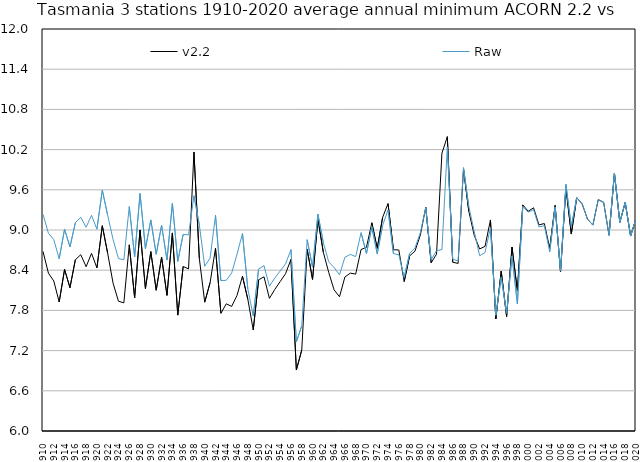
| Category | v2.2 | Raw |
|---|---|---|
| 1910 | 8.681 | 9.236 |
| 1911 | 8.357 | 8.952 |
| 1912 | 8.239 | 8.857 |
| 1913 | 7.925 | 8.57 |
| 1914 | 8.411 | 9.012 |
| 1915 | 8.14 | 8.747 |
| 1916 | 8.556 | 9.109 |
| 1917 | 8.631 | 9.19 |
| 1918 | 8.452 | 9.041 |
| 1919 | 8.651 | 9.219 |
| 1920 | 8.435 | 9.012 |
| 1921 | 9.064 | 9.595 |
| 1922 | 8.65 | 9.218 |
| 1923 | 8.206 | 8.857 |
| 1924 | 7.937 | 8.573 |
| 1925 | 7.912 | 8.556 |
| 1926 | 8.778 | 9.349 |
| 1927 | 7.988 | 8.601 |
| 1928 | 9 | 9.545 |
| 1929 | 8.126 | 8.721 |
| 1930 | 8.677 | 9.15 |
| 1931 | 8.101 | 8.638 |
| 1932 | 8.594 | 9.071 |
| 1933 | 8.025 | 8.551 |
| 1934 | 8.956 | 9.399 |
| 1935 | 7.73 | 8.532 |
| 1936 | 8.456 | 8.934 |
| 1937 | 8.419 | 8.927 |
| 1938 | 10.165 | 9.512 |
| 1939 | 8.573 | 9.076 |
| 1940 | 7.923 | 8.458 |
| 1941 | 8.216 | 8.582 |
| 1942 | 8.729 | 9.22 |
| 1943 | 7.757 | 8.244 |
| 1944 | 7.898 | 8.249 |
| 1945 | 7.859 | 8.359 |
| 1946 | 8.026 | 8.642 |
| 1947 | 8.311 | 8.948 |
| 1948 | 7.964 | 8.119 |
| 1949 | 7.507 | 7.716 |
| 1950 | 8.257 | 8.419 |
| 1951 | 8.302 | 8.468 |
| 1952 | 7.979 | 8.161 |
| 1953 | 8.113 | 8.283 |
| 1954 | 8.23 | 8.388 |
| 1955 | 8.349 | 8.495 |
| 1956 | 8.563 | 8.708 |
| 1957 | 6.91 | 7.328 |
| 1958 | 7.208 | 7.57 |
| 1959 | 8.714 | 8.855 |
| 1960 | 8.262 | 8.446 |
| 1961 | 9.163 | 9.236 |
| 1962 | 8.669 | 8.814 |
| 1963 | 8.367 | 8.524 |
| 1964 | 8.106 | 8.44 |
| 1965 | 8.004 | 8.331 |
| 1966 | 8.298 | 8.593 |
| 1967 | 8.357 | 8.636 |
| 1968 | 8.341 | 8.603 |
| 1969 | 8.709 | 8.96 |
| 1970 | 8.741 | 8.648 |
| 1971 | 9.108 | 9.048 |
| 1972 | 8.726 | 8.643 |
| 1973 | 9.189 | 9.067 |
| 1974 | 9.394 | 9.299 |
| 1975 | 8.705 | 8.648 |
| 1976 | 8.702 | 8.632 |
| 1977 | 8.23 | 8.293 |
| 1978 | 8.613 | 8.649 |
| 1979 | 8.685 | 8.731 |
| 1980 | 8.926 | 8.96 |
| 1981 | 9.34 | 9.334 |
| 1982 | 8.511 | 8.557 |
| 1983 | 8.64 | 8.692 |
| 1984 | 10.146 | 8.707 |
| 1985 | 10.393 | 10.241 |
| 1986 | 8.52 | 8.567 |
| 1987 | 8.501 | 8.537 |
| 1988 | 9.912 | 9.931 |
| 1989 | 9.275 | 9.345 |
| 1990 | 8.919 | 8.973 |
| 1991 | 8.717 | 8.615 |
| 1992 | 8.756 | 8.665 |
| 1993 | 9.15 | 9.035 |
| 1994 | 7.674 | 7.728 |
| 1995 | 8.385 | 8.294 |
| 1996 | 7.707 | 7.758 |
| 1997 | 8.746 | 8.613 |
| 1998 | 8.089 | 7.898 |
| 1999 | 9.375 | 9.352 |
| 2000 | 9.28 | 9.267 |
| 2001 | 9.331 | 9.303 |
| 2002 | 9.077 | 9.046 |
| 2003 | 9.096 | 9.064 |
| 2004 | 8.727 | 8.674 |
| 2005 | 9.366 | 9.345 |
| 2006 | 8.374 | 8.387 |
| 2007 | 9.634 | 9.682 |
| 2008 | 8.94 | 9.053 |
| 2009 | 9.481 | 9.483 |
| 2010 | 9.392 | 9.392 |
| 2011 | 9.163 | 9.163 |
| 2012 | 9.074 | 9.074 |
| 2013 | 9.454 | 9.454 |
| 2014 | 9.412 | 9.412 |
| 2015 | 8.922 | 8.922 |
| 2016 | 9.845 | 9.845 |
| 2017 | 9.115 | 9.115 |
| 2018 | 9.412 | 9.412 |
| 2019 | 8.91 | 8.91 |
| 2020 | 9.171 | 9.171 |